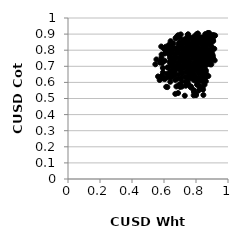
| Category | Series 0 |
|---|---|
| 0.8606674296195633 | 0.803 |
| 0.6999348493348481 | 0.742 |
| 0.7616677487825909 | 0.66 |
| 0.8411690088886075 | 0.869 |
| 0.8267198958037669 | 0.871 |
| 0.6464275884863512 | 0.783 |
| 0.6991743480333439 | 0.678 |
| 0.9055763534838281 | 0.766 |
| 0.6305321046207775 | 0.812 |
| 0.7493462155051412 | 0.796 |
| 0.7926615514258134 | 0.773 |
| 0.8619842693842257 | 0.633 |
| 0.8018020450109519 | 0.855 |
| 0.7681431878229723 | 0.569 |
| 0.7435577358216263 | 0.764 |
| 0.7680098271674152 | 0.656 |
| 0.8462123624348579 | 0.609 |
| 0.7551497769042917 | 0.663 |
| 0.8528021611921892 | 0.847 |
| 0.7980126099627312 | 0.71 |
| 0.7474657759232011 | 0.594 |
| 0.8227832912499451 | 0.868 |
| 0.7874615999468071 | 0.65 |
| 0.6772578194846646 | 0.575 |
| 0.8738030863500944 | 0.84 |
| 0.8219093014470423 | 0.578 |
| 0.7866721516052269 | 0.684 |
| 0.6597053665394986 | 0.694 |
| 0.6516592689620344 | 0.791 |
| 0.7657209606896632 | 0.712 |
| 0.8024218543053964 | 0.814 |
| 0.8706550780828108 | 0.717 |
| 0.669074520028345 | 0.673 |
| 0.8646617876156557 | 0.882 |
| 0.7603945457837402 | 0.694 |
| 0.6247156605005162 | 0.633 |
| 0.8823604310153959 | 0.88 |
| 0.6760753035382701 | 0.877 |
| 0.7093660823693577 | 0.661 |
| 0.8226724688563778 | 0.728 |
| 0.7941110131641931 | 0.805 |
| 0.7574359576495027 | 0.647 |
| 0.828742201009635 | 0.84 |
| 0.7875686067217196 | 0.54 |
| 0.7559894152250648 | 0.727 |
| 0.7127020296447344 | 0.652 |
| 0.8891551870113985 | 0.867 |
| 0.762055454840781 | 0.806 |
| 0.8590485811385213 | 0.736 |
| 0.7184461397085107 | 0.764 |
| 0.863336542518994 | 0.82 |
| 0.7287862776569984 | 0.691 |
| 0.7763459543036225 | 0.633 |
| 0.8511013413340252 | 0.628 |
| 0.7853879393883064 | 0.52 |
| 0.7261053649565652 | 0.747 |
| 0.8073128500880817 | 0.758 |
| 0.7706152322490856 | 0.829 |
| 0.8549010762931147 | 0.88 |
| 0.8164788701928894 | 0.705 |
| 0.7282324067350684 | 0.809 |
| 0.8453413548928314 | 0.829 |
| 0.7408618150149606 | 0.669 |
| 0.5826546042844745 | 0.823 |
| 0.5849590476056439 | 0.773 |
| 0.834208086383052 | 0.807 |
| 0.8829216560381401 | 0.862 |
| 0.7619245457397941 | 0.839 |
| 0.7424667995521614 | 0.876 |
| 0.63430194592752 | 0.775 |
| 0.8665952181532147 | 0.754 |
| 0.6363046175230376 | 0.724 |
| 0.8123294542023353 | 0.776 |
| 0.6272517796509438 | 0.826 |
| 0.7303868740352525 | 0.773 |
| 0.747805615586763 | 0.604 |
| 0.7387196085404604 | 0.739 |
| 0.8531141233221653 | 0.732 |
| 0.7000441003576795 | 0.572 |
| 0.7357308003392908 | 0.579 |
| 0.6686884077655872 | 0.646 |
| 0.886459890604691 | 0.877 |
| 0.7967532162745362 | 0.619 |
| 0.713061950828129 | 0.662 |
| 0.8450386710320554 | 0.754 |
| 0.650107749832884 | 0.709 |
| 0.8830811718809208 | 0.804 |
| 0.6908439687992156 | 0.647 |
| 0.7494634234757541 | 0.64 |
| 0.7966015069082593 | 0.866 |
| 0.6525941603431751 | 0.726 |
| 0.8988485349186075 | 0.743 |
| 0.7642685110995725 | 0.836 |
| 0.8048900127626286 | 0.894 |
| 0.7773979851258961 | 0.749 |
| 0.9141915747024514 | 0.809 |
| 0.6805559746553618 | 0.793 |
| 0.7753563499236906 | 0.77 |
| 0.7313395420374461 | 0.755 |
| 0.7403778849098179 | 0.742 |
| 0.6369871910606489 | 0.753 |
| 0.794139560420247 | 0.785 |
| 0.5459135540867835 | 0.713 |
| 0.8891057101044171 | 0.728 |
| 0.8570862290025462 | 0.799 |
| 0.8404834262172327 | 0.676 |
| 0.8190058497395645 | 0.88 |
| 0.7832564238110448 | 0.677 |
| 0.7670144380952288 | 0.684 |
| 0.6049131091752462 | 0.62 |
| 0.8841599138822888 | 0.758 |
| 0.769766131755828 | 0.711 |
| 0.7914323824373495 | 0.853 |
| 0.8394290192869471 | 0.851 |
| 0.900254879935451 | 0.817 |
| 0.7705790342479129 | 0.766 |
| 0.5785080369647733 | 0.731 |
| 0.7730563596486816 | 0.839 |
| 0.7109604963369003 | 0.573 |
| 0.7114264282506166 | 0.605 |
| 0.7945318887647026 | 0.636 |
| 0.7047854540880232 | 0.898 |
| 0.7987490666397192 | 0.685 |
| 0.657621811892098 | 0.703 |
| 0.7972365121890362 | 0.864 |
| 0.8160670857000676 | 0.739 |
| 0.8172476007302536 | 0.804 |
| 0.8645980398335521 | 0.886 |
| 0.6465674440631175 | 0.669 |
| 0.6473330996554859 | 0.714 |
| 0.69388869733561 | 0.719 |
| 0.822845698345114 | 0.781 |
| 0.6835287564256733 | 0.692 |
| 0.7262040441602107 | 0.866 |
| 0.7393463433897386 | 0.665 |
| 0.7431892750957874 | 0.84 |
| 0.7576750658893622 | 0.738 |
| 0.8205171400303991 | 0.751 |
| 0.8955819652153647 | 0.712 |
| 0.8456059353965881 | 0.72 |
| 0.8621538082955802 | 0.706 |
| 0.8574976041245859 | 0.811 |
| 0.7011321767333416 | 0.734 |
| 0.727032698446707 | 0.73 |
| 0.8115324630853016 | 0.667 |
| 0.7130231030299599 | 0.769 |
| 0.9100789554782126 | 0.808 |
| 0.8610060682945005 | 0.662 |
| 0.6461637803023965 | 0.674 |
| 0.5815749823376429 | 0.732 |
| 0.7684164012723802 | 0.771 |
| 0.57873007427408 | 0.728 |
| 0.6897111563245267 | 0.71 |
| 0.791592401936394 | 0.707 |
| 0.6381668285140478 | 0.654 |
| 0.7902167455943879 | 0.848 |
| 0.8214099296545454 | 0.729 |
| 0.841845915618669 | 0.706 |
| 0.8655235738521514 | 0.744 |
| 0.8470280653277532 | 0.861 |
| 0.6705704897241429 | 0.615 |
| 0.7714581741482851 | 0.876 |
| 0.6950713011940342 | 0.706 |
| 0.7634400294237285 | 0.803 |
| 0.8624804471045378 | 0.648 |
| 0.552539735679884 | 0.743 |
| 0.6047432097485013 | 0.779 |
| 0.8455813681659083 | 0.811 |
| 0.643227611150495 | 0.63 |
| 0.8653294060950341 | 0.818 |
| 0.7461143308959663 | 0.831 |
| 0.7656652444362569 | 0.806 |
| 0.846718511545769 | 0.633 |
| 0.7617597047274746 | 0.578 |
| 0.7111814085209395 | 0.78 |
| 0.8520275885324056 | 0.787 |
| 0.7711167658126614 | 0.71 |
| 0.6589163452898665 | 0.843 |
| 0.8876979161435098 | 0.754 |
| 0.7415588676593998 | 0.737 |
| 0.638925142293215 | 0.731 |
| 0.842803687995572 | 0.827 |
| 0.5927702129927285 | 0.69 |
| 0.8888104122212008 | 0.875 |
| 0.7506243877987404 | 0.859 |
| 0.8258061881006242 | 0.727 |
| 0.7126045932211109 | 0.704 |
| 0.8164320188498746 | 0.657 |
| 0.8816331317544839 | 0.838 |
| 0.7605180500470761 | 0.797 |
| 0.7689107483400326 | 0.574 |
| 0.5840231444493837 | 0.754 |
| 0.6778154042169096 | 0.788 |
| 0.7299447843663049 | 0.517 |
| 0.7433305532417129 | 0.775 |
| 0.6364237006245839 | 0.801 |
| 0.6215099641155544 | 0.693 |
| 0.6720542953454912 | 0.874 |
| 0.7782598846361921 | 0.871 |
| 0.8689872887404752 | 0.895 |
| 0.6974467133722992 | 0.739 |
| 0.6394360754973103 | 0.604 |
| 0.8635625449101264 | 0.836 |
| 0.810560085752624 | 0.726 |
| 0.8016937719703552 | 0.531 |
| 0.6568893812398542 | 0.642 |
| 0.7407771515292378 | 0.808 |
| 0.5760868745589425 | 0.723 |
| 0.8873434219742073 | 0.855 |
| 0.6512638997739032 | 0.781 |
| 0.6652056943328782 | 0.658 |
| 0.6767092164983124 | 0.812 |
| 0.8756846499300529 | 0.776 |
| 0.8209297307973322 | 0.726 |
| 0.8008426721371884 | 0.786 |
| 0.8641630802995725 | 0.791 |
| 0.771986340988601 | 0.646 |
| 0.7552100750282434 | 0.827 |
| 0.7126084199542722 | 0.697 |
| 0.8496559043590572 | 0.617 |
| 0.5934084951309078 | 0.625 |
| 0.8584434143177334 | 0.774 |
| 0.7466401838204122 | 0.7 |
| 0.8389305771052886 | 0.698 |
| 0.6411942763267084 | 0.826 |
| 0.8732103970196142 | 0.895 |
| 0.8233443501146176 | 0.656 |
| 0.5971302854120267 | 0.814 |
| 0.6420376646838131 | 0.812 |
| 0.827682074088159 | 0.657 |
| 0.7012180453999416 | 0.832 |
| 0.6882295356850916 | 0.534 |
| 0.6162200985139986 | 0.791 |
| 0.7931456751874846 | 0.836 |
| 0.6272098400817191 | 0.779 |
| 0.8351566433848229 | 0.785 |
| 0.6540176816289807 | 0.642 |
| 0.8536086110617027 | 0.586 |
| 0.8827212616734962 | 0.839 |
| 0.7895378014868231 | 0.885 |
| 0.8160166289097711 | 0.672 |
| 0.8732998928667913 | 0.764 |
| 0.8114623580518086 | 0.743 |
| 0.6050389218129978 | 0.805 |
| 0.6432901844368986 | 0.668 |
| 0.7687681902367982 | 0.626 |
| 0.7146784816566172 | 0.78 |
| 0.617539525077824 | 0.653 |
| 0.8188739694740013 | 0.552 |
| 0.6434206310784697 | 0.735 |
| 0.7919602599321796 | 0.867 |
| 0.6331478008929023 | 0.654 |
| 0.8189360760480737 | 0.758 |
| 0.6637279790685899 | 0.804 |
| 0.7519100591954112 | 0.835 |
| 0.6808461745985499 | 0.694 |
| 0.8506954751676822 | 0.768 |
| 0.7158261729020052 | 0.859 |
| 0.8812523412218833 | 0.79 |
| 0.8160749519391077 | 0.76 |
| 0.7884967793261731 | 0.823 |
| 0.8109143930961263 | 0.903 |
| 0.8181013925329039 | 0.801 |
| 0.8621398829910908 | 0.674 |
| 0.6970379652420732 | 0.751 |
| 0.7190223024847787 | 0.804 |
| 0.8428332807702796 | 0.753 |
| 0.8432223522655187 | 0.659 |
| 0.8367260831390656 | 0.754 |
| 0.8504165880620544 | 0.848 |
| 0.8012370942996936 | 0.794 |
| 0.738294205019498 | 0.807 |
| 0.8408728543970745 | 0.765 |
| 0.6913028649901257 | 0.83 |
| 0.8579816799352373 | 0.9 |
| 0.6670168252955941 | 0.762 |
| 0.8399845630766394 | 0.757 |
| 0.8861856365076313 | 0.838 |
| 0.6882287428264124 | 0.893 |
| 0.7261095750426819 | 0.816 |
| 0.7459321257994539 | 0.59 |
| 0.6970139019152364 | 0.748 |
| 0.7373628606863207 | 0.842 |
| 0.88455626767976 | 0.802 |
| 0.7836164829181484 | 0.78 |
| 0.6478032502909709 | 0.725 |
| 0.8124582857779081 | 0.693 |
| 0.8676851310975964 | 0.809 |
| 0.8123425496476344 | 0.69 |
| 0.754673587195449 | 0.764 |
| 0.6343893063387842 | 0.639 |
| 0.8414378532127648 | 0.571 |
| 0.8302352892545374 | 0.873 |
| 0.7100712161584233 | 0.735 |
| 0.7796773033210417 | 0.647 |
| 0.7695225444960228 | 0.811 |
| 0.7306427456611819 | 0.793 |
| 0.8003189563681707 | 0.521 |
| 0.907408295325438 | 0.895 |
| 0.6256235291805492 | 0.693 |
| 0.8162489379057041 | 0.807 |
| 0.8254555309737044 | 0.848 |
| 0.8616560084394712 | 0.647 |
| 0.6956451369858517 | 0.812 |
| 0.6212432720647237 | 0.571 |
| 0.720477365442941 | 0.758 |
| 0.7855729514309479 | 0.857 |
| 0.7637636017744206 | 0.873 |
| 0.7814882263432091 | 0.857 |
| 0.7459905355448025 | 0.875 |
| 0.7358517985887805 | 0.712 |
| 0.7688238770647915 | 0.682 |
| 0.842272771584692 | 0.806 |
| 0.7302664166692087 | 0.764 |
| 0.8461545169753178 | 0.522 |
| 0.844170841511323 | 0.555 |
| 0.8558165645070729 | 0.702 |
| 0.6756918324898885 | 0.782 |
| 0.8793673836888554 | 0.847 |
| 0.6697015563728509 | 0.748 |
| 0.7373575613773131 | 0.605 |
| 0.7338297327523413 | 0.794 |
| 0.691371620526104 | 0.802 |
| 0.8074120999186758 | 0.588 |
| 0.8077988816557793 | 0.585 |
| 0.7095622871951144 | 0.823 |
| 0.5728358254917891 | 0.615 |
| 0.7044281247054887 | 0.831 |
| 0.7824979367259741 | 0.76 |
| 0.8358422573948905 | 0.797 |
| 0.8836147786046735 | 0.842 |
| 0.7482022941452053 | 0.896 |
| 0.7623057017008482 | 0.713 |
| 0.8225426360062331 | 0.614 |
| 0.5930507305441419 | 0.662 |
| 0.7599118574750922 | 0.73 |
| 0.6308427904724045 | 0.833 |
| 0.7845202420389474 | 0.878 |
| 0.9053722029688596 | 0.863 |
| 0.6418973694429907 | 0.702 |
| 0.6100719539650808 | 0.821 |
| 0.7513478799309836 | 0.691 |
| 0.6933517373490123 | 0.584 |
| 0.7376611831939885 | 0.798 |
| 0.7434453143042599 | 0.748 |
| 0.7204320791972769 | 0.79 |
| 0.8066670010785599 | 0.815 |
| 0.6434577743966531 | 0.76 |
| 0.6980150477723515 | 0.879 |
| 0.744905515403242 | 0.711 |
| 0.7880729395410742 | 0.613 |
| 0.7361378238014964 | 0.711 |
| 0.8360929218424951 | 0.771 |
| 0.6484453032848716 | 0.708 |
| 0.8866137057355947 | 0.738 |
| 0.8019331473024236 | 0.719 |
| 0.6650036045078405 | 0.679 |
| 0.6962325599154053 | 0.849 |
| 0.7928297448203554 | 0.682 |
| 0.7898124238405653 | 0.644 |
| 0.8822482747321022 | 0.736 |
| 0.8028730310165905 | 0.899 |
| 0.658191332485484 | 0.816 |
| 0.7047466177103434 | 0.582 |
| 0.7480536045886679 | 0.779 |
| 0.715517951827609 | 0.847 |
| 0.5947877311453806 | 0.632 |
| 0.6858024636704033 | 0.798 |
| 0.7136596140645739 | 0.781 |
| 0.7961207807155652 | 0.719 |
| 0.8444600061460612 | 0.833 |
| 0.8743394994264134 | 0.907 |
| 0.7446216024779657 | 0.716 |
| 0.7099891387505436 | 0.681 |
| 0.9069599333466056 | 0.751 |
| 0.836795488901021 | 0.607 |
| 0.7525174033381757 | 0.785 |
| 0.7510028570557167 | 0.899 |
| 0.7193258204121296 | 0.788 |
| 0.6541839868776258 | 0.744 |
| 0.872896986666136 | 0.875 |
| 0.8433581901337426 | 0.745 |
| 0.833323076782873 | 0.633 |
| 0.6751179676581265 | 0.78 |
| 0.8483396610296318 | 0.727 |
| 0.8437210322174159 | 0.812 |
| 0.9012390827462435 | 0.778 |
| 0.8585504949483894 | 0.714 |
| 0.8510120033335822 | 0.863 |
| 0.9194648370120022 | 0.891 |
| 0.8474053975248491 | 0.793 |
| 0.8456537909505505 | 0.667 |
| 0.8771244551785382 | 0.639 |
| 0.8381008172166687 | 0.88 |
| 0.7406125934618681 | 0.778 |
| 0.7928154490153846 | 0.725 |
| 0.8209800229967568 | 0.785 |
| 0.6403085808956992 | 0.671 |
| 0.7827902294649498 | 0.704 |
| 0.7598837539863926 | 0.728 |
| 0.8518240353415665 | 0.781 |
| 0.8639974517395514 | 0.86 |
| 0.7330760248281251 | 0.697 |
| 0.8110676950247908 | 0.903 |
| 0.7776440490762082 | 0.75 |
| 0.887156787991738 | 0.712 |
| 0.7192929396571459 | 0.76 |
| 0.7769802574483803 | 0.81 |
| 0.7972150962828148 | 0.741 |
| 0.7143906212037885 | 0.829 |
| 0.7648619522165659 | 0.663 |
| 0.7048843219547547 | 0.846 |
| 0.588480018183968 | 0.721 |
| 0.7954755921440668 | 0.697 |
| 0.8320142247372411 | 0.74 |
| 0.8070732064053938 | 0.808 |
| 0.8154648838161828 | 0.677 |
| 0.9168791066861814 | 0.737 |
| 0.8454649617052246 | 0.856 |
| 0.7266859913749804 | 0.842 |
| 0.7900644041797736 | 0.808 |
| 0.6706492969897138 | 0.529 |
| 0.7255200053472541 | 0.814 |
| 0.7894816522489216 | 0.724 |
| 0.7429976671749301 | 0.754 |
| 0.5870163637829766 | 0.642 |
| 0.7720208843058256 | 0.699 |
| 0.6624426611995167 | 0.73 |
| 0.8728043854501029 | 0.856 |
| 0.7025828976432815 | 0.828 |
| 0.8609967691228757 | 0.799 |
| 0.6429583677941685 | 0.648 |
| 0.7416127455879985 | 0.818 |
| 0.7530693315505331 | 0.678 |
| 0.8442991067638911 | 0.771 |
| 0.8372617934690381 | 0.67 |
| 0.6933276740843215 | 0.842 |
| 0.8058727729384143 | 0.672 |
| 0.6703814946113574 | 0.683 |
| 0.7213331623919413 | 0.713 |
| 0.8910280880502676 | 0.839 |
| 0.6411084712254504 | 0.856 |
| 0.8143298448394103 | 0.795 |
| 0.7194363556164171 | 0.8 |
| 0.6138185248696718 | 0.572 |
| 0.7387586893795919 | 0.779 |
| 0.8442049988724978 | 0.859 |
| 0.6968606523427461 | 0.7 |
| 0.7181515564083577 | 0.695 |
| 0.7070734164161767 | 0.625 |
| 0.6718680601866465 | 0.704 |
| 0.771853121932835 | 0.765 |
| 0.5626353920811603 | 0.637 |
| 0.6658955000600157 | 0.729 |
| 0.9075158176961985 | 0.857 |
| 0.6385023435321047 | 0.767 |
| 0.8131902977208034 | 0.815 |
| 0.7691106939562756 | 0.788 |
| 0.6987520512703356 | 0.777 |
| 0.7505278971956673 | 0.815 |
| 0.8474921745575865 | 0.86 |
| 0.8355750631343921 | 0.65 |
| 0.8133706491991705 | 0.617 |
| 0.7797402582255332 | 0.68 |
| 0.8616905165206683 | 0.607 |
| 0.8347440914619624 | 0.756 |
| 0.9161142594718537 | 0.889 |
| 0.781087082239773 | 0.788 |
| 0.8326654531886902 | 0.811 |
| 0.749211119185095 | 0.626 |
| 0.7324775383770947 | 0.634 |
| 0.845114418180007 | 0.726 |
| 0.8674768130904551 | 0.791 |
| 0.8825468005825443 | 0.907 |
| 0.697797758133453 | 0.807 |
| 0.8707045738688799 | 0.807 |
| 0.6849056354397289 | 0.623 |
| 0.8386834437142767 | 0.815 |
| 0.6848424068489334 | 0.721 |
| 0.8091697740681953 | 0.833 |
| 0.7415007348585687 | 0.692 |
| 0.7980468678304317 | 0.701 |
| 0.7151596529411938 | 0.803 |
| 0.8161887267536658 | 0.631 |
| 0.8448166552464678 | 0.828 |
| 0.7118552771083579 | 0.831 |
| 0.894736558725845 | 0.79 |
| 0.8938141572880075 | 0.747 |
| 0.7635390377683873 | 0.693 |
| 0.6331560485504961 | 0.784 |
| 0.6985566285213716 | 0.847 |
| 0.6766555498901607 | 0.753 |
| 0.8908530128783441 | 0.831 |
| 0.8074035565970805 | 0.606 |
| 0.6049050308760262 | 0.734 |
| 0.6784215488501559 | 0.88 |
| 0.814353950755379 | 0.686 |
| 0.6848092788462434 | 0.888 |
| 0.9031988923091763 | 0.889 |
| 0.7848701350929661 | 0.553 |